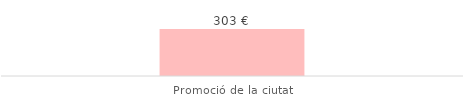
| Category | Total |
|---|---|
| Promoció de la ciutat | 302.5 |